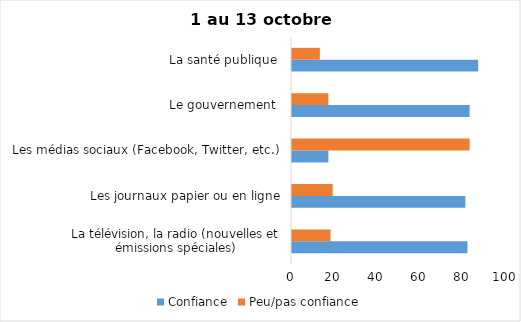
| Category | Confiance | Peu/pas confiance |
|---|---|---|
| La télévision, la radio (nouvelles et émissions spéciales) | 82 | 18 |
| Les journaux papier ou en ligne | 81 | 19 |
| Les médias sociaux (Facebook, Twitter, etc.) | 17 | 83 |
| Le gouvernement  | 83 | 17 |
| La santé publique  | 87 | 13 |